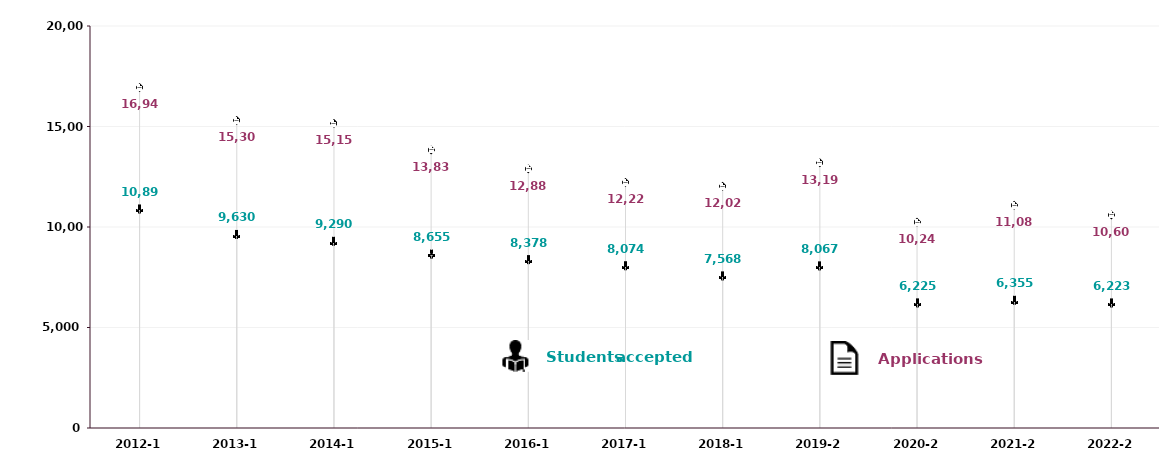
| Category | Applications | Students Accepted |
|---|---|---|
| 2012-13 | 16944 | 10897 |
| 2013-14 | 15300 | 9630 |
| 2014-15 | 15157 | 9290 |
| 2015-16 | 13833 | 8655 |
| 2016-17 | 12889 | 8378 |
| 2017-18 | 12221 | 8074 |
| 2018-19 | 12028 | 7568 |
| 2019-20 | 13198 | 8067 |
| 2020-21 | 10242 | 6225 |
| 2021-22 | 11082 | 6355 |
| 2022-23 | 10601 | 6223 |